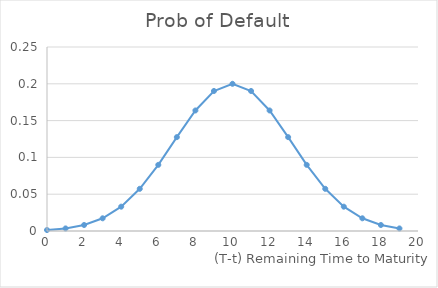
| Category | Prob of Default |
|---|---|
| 19.0 | 0.003 |
| 18.0 | 0.008 |
| 17.0 | 0.017 |
| 16.0 | 0.033 |
| 15.0 | 0.057 |
| 14.0 | 0.09 |
| 13.0 | 0.128 |
| 12.0 | 0.164 |
| 11.0 | 0.19 |
| 10.0 | 0.2 |
| 9.0 | 0.19 |
| 8.0 | 0.164 |
| 7.0 | 0.128 |
| 6.0 | 0.09 |
| 5.0 | 0.057 |
| 4.0 | 0.033 |
| 3.0 | 0.017 |
| 2.0 | 0.008 |
| 1.0 | 0.003 |
| 0.0 | 0.001 |